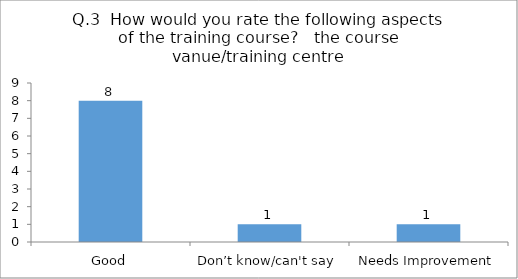
| Category | Q.3  How would you rate the following aspects of the training course?  |
|---|---|
| Good | 8 |
| Don’t know/can't say | 1 |
| Needs Improvement | 1 |